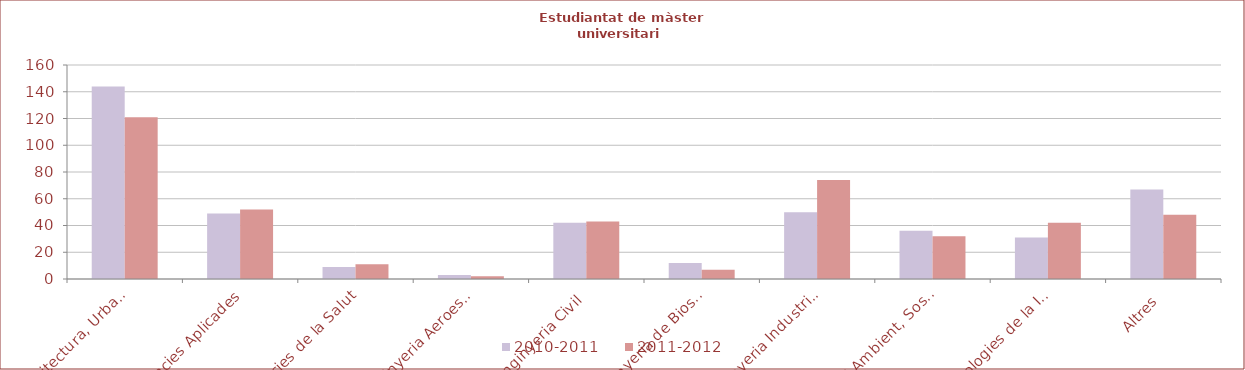
| Category | 2010-2011 | 2011-2012 |
|---|---|---|
| Arquitectura, Urbanisme i Edificació | 144 | 121 |
| Ciències Aplicades | 49 | 52 |
| Ciències de la Salut | 9 | 11 |
| Enginyeria Aeroespacial | 3 | 2 |
| Enginyeria Civil | 42 | 43 |
| Enginyeria de Biosistemes | 12 | 7 |
| Enginyeria Industrial | 50 | 74 |
| Medi Ambient, Sostenibilitat i Recursos Naturals | 36 | 32 |
| Tecnologies de la Informació i les Comunicacions | 31 | 42 |
| Altres | 67 | 48 |